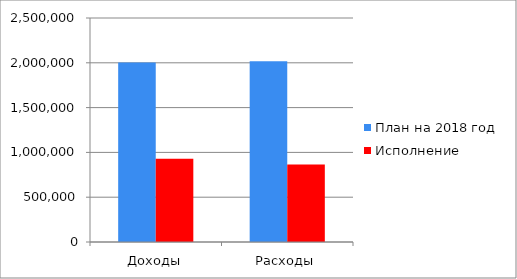
| Category | План на 2018 год | Исполнение |
|---|---|---|
| Доходы | 2002766.94 | 930490.37 |
| Расходы | 2016238 | 864479.96 |